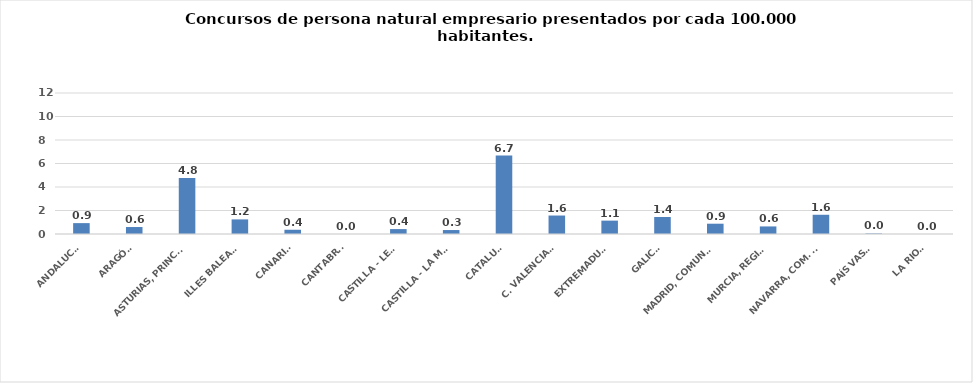
| Category | Series 0 |
|---|---|
| ANDALUCÍA | 0.926 |
| ARAGÓN | 0.593 |
| ASTURIAS, PRINCIPADO | 4.769 |
| ILLES BALEARS | 1.243 |
| CANARIAS | 0.362 |
| CANTABRIA | 0 |
| CASTILLA - LEÓN | 0.42 |
| CASTILLA - LA MANCHA | 0.336 |
| CATALUÑA | 6.672 |
| C. VALENCIANA | 1.571 |
| EXTREMADURA | 1.138 |
| GALICIA | 1.445 |
| MADRID, COMUNIDAD | 0.876 |
| MURCIA, REGIÓN | 0.644 |
| NAVARRA, COM. FORAL | 1.636 |
| PAÍS VASCO | 0.045 |
| LA RIOJA | 0 |